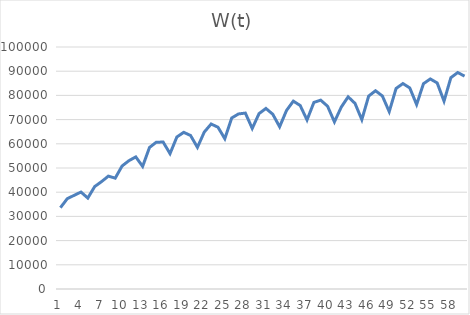
| Category | W(t) |
|---|---|
| 0 | 33602.914 |
| 1 | 37318.838 |
| 2 | 38705.392 |
| 3 | 40058.737 |
| 4 | 37579.018 |
| 5 | 42324.75 |
| 6 | 44364.791 |
| 7 | 46634.228 |
| 8 | 45808.988 |
| 9 | 50828.953 |
| 10 | 53021.972 |
| 11 | 54586.077 |
| 12 | 50657.57 |
| 13 | 58474.262 |
| 14 | 60679.056 |
| 15 | 60701.402 |
| 16 | 55933.562 |
| 17 | 62819.73 |
| 18 | 64738.76 |
| 19 | 63430.418 |
| 20 | 58529.909 |
| 21 | 64860.833 |
| 22 | 68175.792 |
| 23 | 66854.696 |
| 24 | 62096.668 |
| 25 | 70664.1 |
| 26 | 72340.904 |
| 27 | 72694.405 |
| 28 | 66350.151 |
| 29 | 72499.083 |
| 30 | 74605.804 |
| 31 | 72211.509 |
| 32 | 67034.37 |
| 33 | 73754.303 |
| 34 | 77633.761 |
| 35 | 75834.408 |
| 36 | 69852.187 |
| 37 | 77084.832 |
| 38 | 78026.801 |
| 39 | 75528.881 |
| 40 | 69060.22 |
| 41 | 75161.717 |
| 42 | 79404.043 |
| 43 | 76732.305 |
| 44 | 69971.645 |
| 45 | 79728.53 |
| 46 | 81927.61 |
| 47 | 79754.656 |
| 48 | 73279.566 |
| 49 | 82862.916 |
| 50 | 84895.49 |
| 51 | 83085.705 |
| 52 | 76223.565 |
| 53 | 84848.906 |
| 54 | 86796.948 |
| 55 | 85151.78 |
| 56 | 77629.539 |
| 57 | 87338.968 |
| 58 | 89457.211 |
| 59 | 87958.106 |